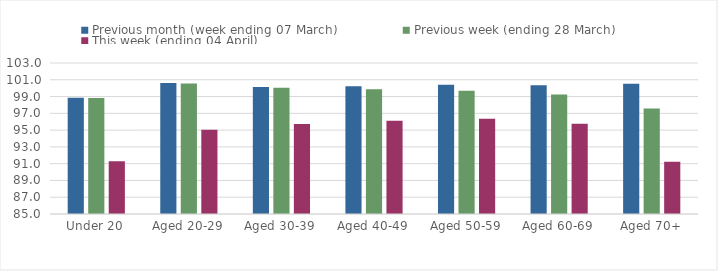
| Category | Previous month (week ending 07 March) | Previous week (ending 28 March) | This week (ending 04 April) |
|---|---|---|---|
| Under 20 | 98.849 | 98.833 | 91.28 |
| Aged 20-29 | 100.603 | 100.549 | 95.035 |
| Aged 30-39 | 100.127 | 100.037 | 95.718 |
| Aged 40-49 | 100.223 | 99.872 | 96.105 |
| Aged 50-59 | 100.406 | 99.68 | 96.339 |
| Aged 60-69 | 100.349 | 99.253 | 95.76 |
| Aged 70+ | 100.529 | 97.562 | 91.219 |